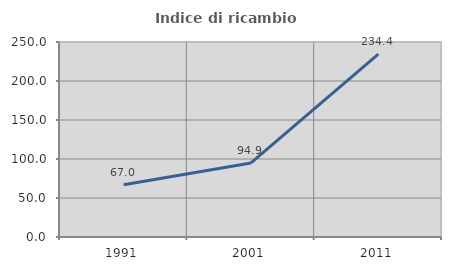
| Category | Indice di ricambio occupazionale  |
|---|---|
| 1991.0 | 67.037 |
| 2001.0 | 94.901 |
| 2011.0 | 234.362 |